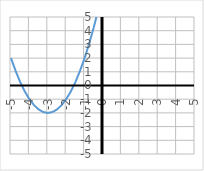
| Category | y |
|---|---|
| -5.0 | 2 |
| -4.75 | 1.062 |
| -4.5 | 0.25 |
| -4.25 | -0.438 |
| -4.0 | -1 |
| -3.75 | -1.438 |
| -3.5 | -1.75 |
| -3.25 | -1.938 |
| -3.0 | -2 |
| -2.75 | -1.938 |
| -2.5 | -1.75 |
| -2.25 | -1.438 |
| -2.0 | -1 |
| -1.75 | -0.438 |
| -1.5 | 0.25 |
| -1.25 | 1.062 |
| -1.0 | 2 |
| -0.75 | 3.062 |
| -0.5 | 4.25 |
| -0.25 | 5.562 |
| 0.0 | 7 |
| 0.25 | 8.562 |
| 0.5 | 10.25 |
| 0.75 | 12.062 |
| 1.0 | 14 |
| 1.25 | 16.062 |
| 1.5 | 18.25 |
| 1.75 | 20.562 |
| 2.0 | 23 |
| 2.25 | 25.562 |
| 2.5 | 28.25 |
| 2.75 | 31.062 |
| 3.0 | 34 |
| 3.25 | 37.062 |
| 3.5 | 40.25 |
| 3.75 | 43.562 |
| 4.0 | 47 |
| 4.25 | 50.562 |
| 4.5 | 54.25 |
| 4.75 | 58.062 |
| 5.0 | 62 |